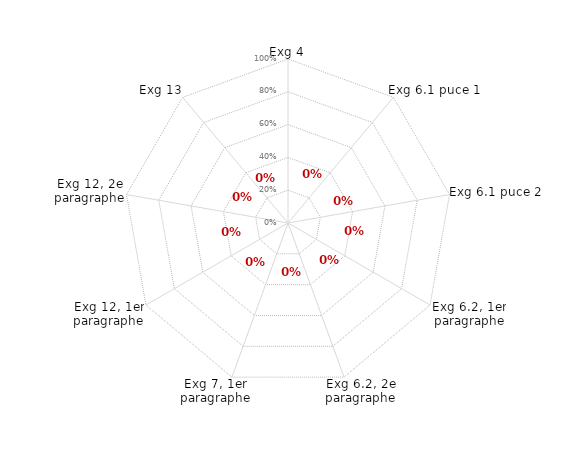
| Category | annexe XI |
|---|---|
| Exg 4 | 0 |
| Exg 6.1 puce 1 | 0 |
| Exg 6.1 puce 2 | 0 |
| Exg 6.2, 1er paragraphe | 0 |
| Exg 6.2, 2e paragraphe | 0 |
| Exg 7, 1er paragraphe | 0 |
| Exg 12, 1er paragraphe | 0 |
| Exg 12, 2e paragraphe | 0 |
| Exg 13 | 0 |